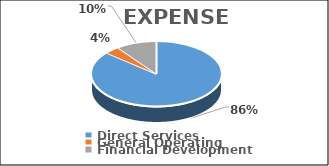
| Category | Series 0 | Series 1 |
|---|---|---|
| Direct Services | 0.861 | 0.861 |
| General Operating | 0.038 | 0.038 |
| Financial Development | 0.101 | 0.101 |